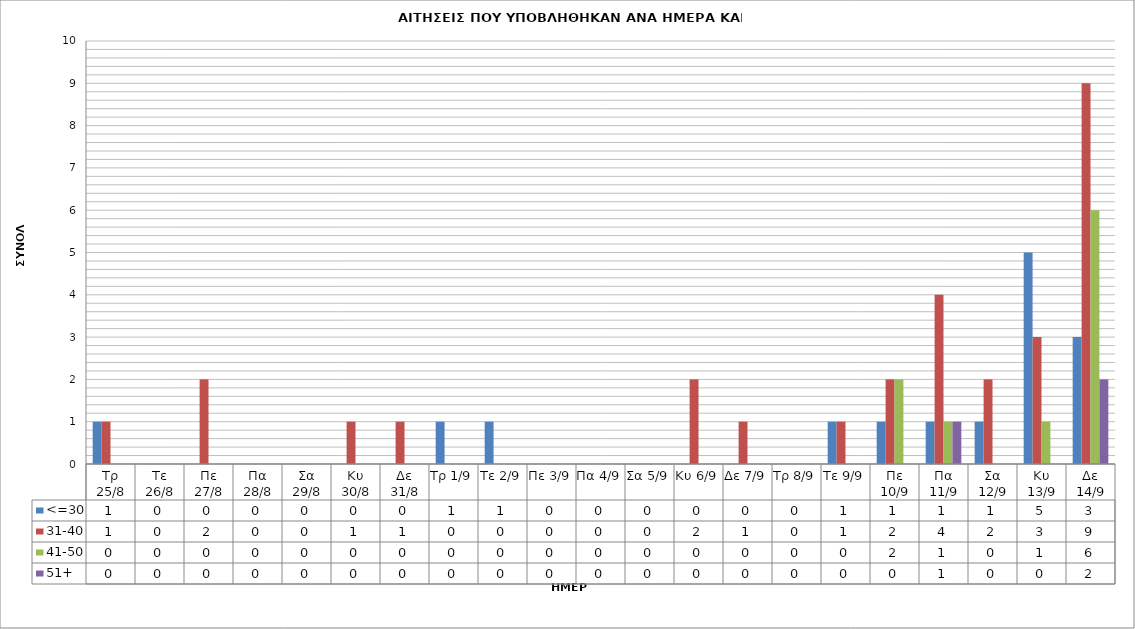
| Category | <=30 | 31-40 | 41-50 | 51+ |
|---|---|---|---|---|
| Τρ 25/8 | 1 | 1 | 0 | 0 |
| Τε 26/8 | 0 | 0 | 0 | 0 |
| Πε 27/8 | 0 | 2 | 0 | 0 |
| Πα 28/8 | 0 | 0 | 0 | 0 |
| Σα 29/8 | 0 | 0 | 0 | 0 |
| Κυ 30/8 | 0 | 1 | 0 | 0 |
| Δε 31/8 | 0 | 1 | 0 | 0 |
| Τρ 1/9 | 1 | 0 | 0 | 0 |
| Τε 2/9 | 1 | 0 | 0 | 0 |
| Πε 3/9 | 0 | 0 | 0 | 0 |
| Πα 4/9 | 0 | 0 | 0 | 0 |
| Σα 5/9 | 0 | 0 | 0 | 0 |
| Κυ 6/9 | 0 | 2 | 0 | 0 |
| Δε 7/9 | 0 | 1 | 0 | 0 |
| Τρ 8/9 | 0 | 0 | 0 | 0 |
| Τε 9/9 | 1 | 1 | 0 | 0 |
| Πε 10/9 | 1 | 2 | 2 | 0 |
| Πα 11/9 | 1 | 4 | 1 | 1 |
| Σα 12/9 | 1 | 2 | 0 | 0 |
| Κυ 13/9 | 5 | 3 | 1 | 0 |
| Δε 14/9 | 3 | 9 | 6 | 2 |